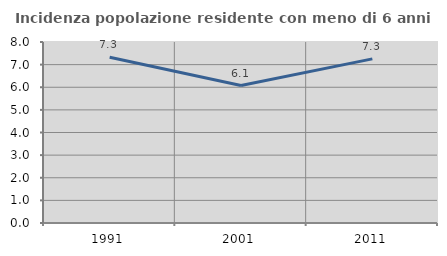
| Category | Incidenza popolazione residente con meno di 6 anni |
|---|---|
| 1991.0 | 7.326 |
| 2001.0 | 6.074 |
| 2011.0 | 7.253 |